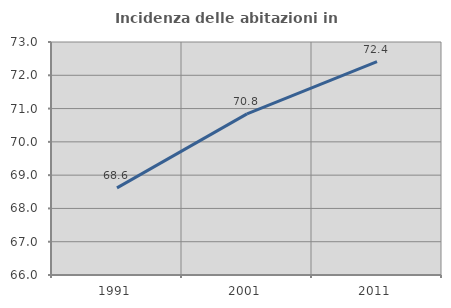
| Category | Incidenza delle abitazioni in proprietà  |
|---|---|
| 1991.0 | 68.618 |
| 2001.0 | 70.84 |
| 2011.0 | 72.409 |